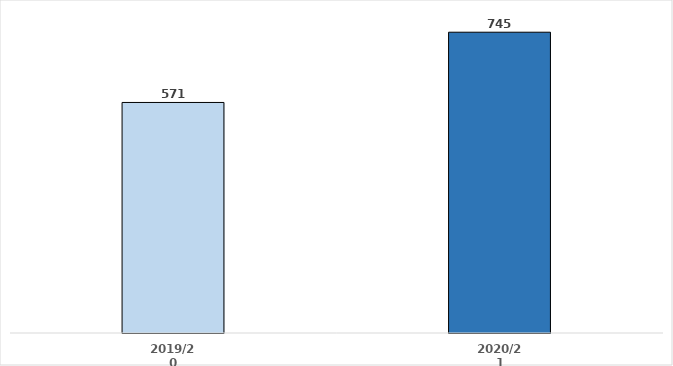
| Category | Series 0 |
|---|---|
| 2019/20 | 571 |
| 2020/21 | 745 |